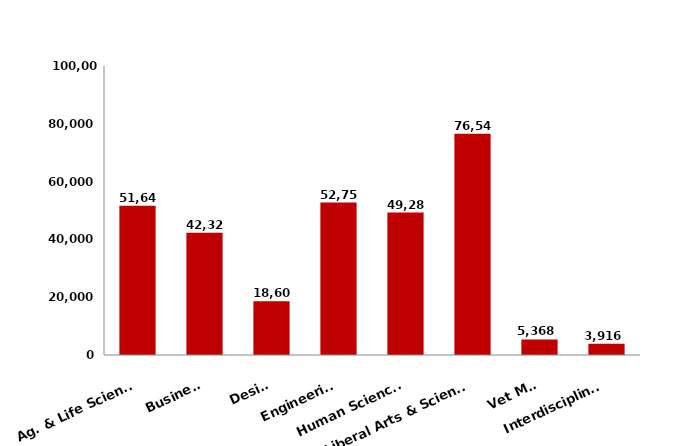
| Category | Series 0 |
|---|---|
| Ag. & Life Sciences | 51644 |
| Business | 42328 |
| Design | 18607 |
| Engineering | 52759 |
| Human Sciences | 49282 |
| Liberal Arts & Sciences | 76544 |
| Vet Med | 5368 |
| Interdisciplinary | 3916 |